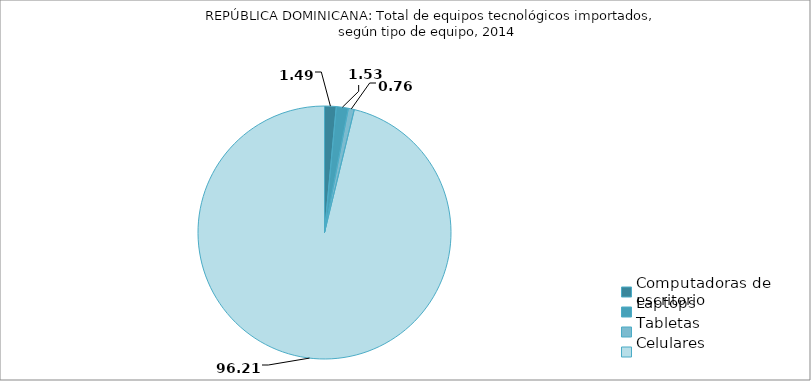
| Category | REPÚBLICA DOMINICANA: Total de equipos tecnológicos importados, 
según tipo de equipo, 2014  |
|---|---|
| Computadoras de escritorio | 1.487 |
| Laptops | 1.534 |
| Tabletas | 0.765 |
| Celulares | 96.215 |